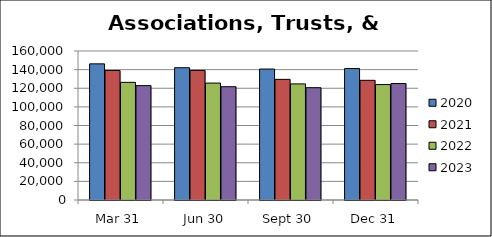
| Category | 2020 | 2021 | 2022 | 2023 |
|---|---|---|---|---|
| Mar 31 | 146182 | 139093 | 126356 | 122806 |
| Jun 30 | 142037 | 139150 | 125566 | 121648 |
| Sept 30 | 140627 | 129543 | 124670 | 120604 |
| Dec 31 | 141156 | 128510 | 123945 | 125064 |